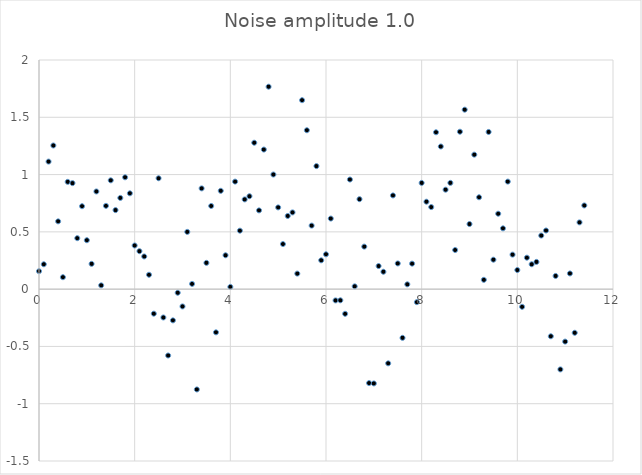
| Category | Series 0 |
|---|---|
| 0.0 | 0.157 |
| 0.1 | 0.217 |
| 0.2 | 1.113 |
| 0.3 | 1.254 |
| 0.4 | 0.592 |
| 0.5 | 0.104 |
| 0.6 | 0.936 |
| 0.7 | 0.925 |
| 0.8 | 0.445 |
| 0.9 | 0.724 |
| 1.0 | 0.427 |
| 1.1 | 0.221 |
| 1.2 | 0.853 |
| 1.3 | 0.033 |
| 1.4 | 0.727 |
| 1.5 | 0.95 |
| 1.6 | 0.69 |
| 1.7 | 0.796 |
| 1.8 | 0.976 |
| 1.900000000000001 | 0.836 |
| 2.0 | 0.381 |
| 2.100000000000001 | 0.331 |
| 2.200000000000001 | 0.285 |
| 2.300000000000001 | 0.125 |
| 2.400000000000001 | -0.214 |
| 2.500000000000001 | 0.968 |
| 2.600000000000001 | -0.247 |
| 2.700000000000001 | -0.579 |
| 2.800000000000001 | -0.272 |
| 2.900000000000001 | -0.031 |
| 3.000000000000001 | -0.151 |
| 3.100000000000001 | 0.5 |
| 3.200000000000001 | 0.046 |
| 3.300000000000002 | -0.876 |
| 3.400000000000002 | 0.879 |
| 3.500000000000002 | 0.23 |
| 3.600000000000002 | 0.726 |
| 3.700000000000002 | -0.377 |
| 3.800000000000002 | 0.858 |
| 3.900000000000002 | 0.296 |
| 4.000000000000002 | 0.019 |
| 4.100000000000001 | 0.939 |
| 4.200000000000001 | 0.51 |
| 4.300000000000001 | 0.783 |
| 4.4 | 0.811 |
| 4.5 | 1.278 |
| 4.6 | 0.687 |
| 4.699999999999999 | 1.218 |
| 4.799999999999999 | 1.767 |
| 4.899999999999999 | 1 |
| 4.999999999999998 | 0.713 |
| 5.099999999999998 | 0.394 |
| 5.199999999999997 | 0.639 |
| 5.299999999999997 | 0.67 |
| 5.399999999999997 | 0.136 |
| 5.499999999999996 | 1.649 |
| 5.599999999999996 | 1.387 |
| 5.699999999999996 | 0.555 |
| 5.799999999999995 | 1.074 |
| 5.899999999999995 | 0.252 |
| 5.999999999999994 | 0.304 |
| 6.099999999999994 | 0.616 |
| 6.199999999999994 | -0.098 |
| 6.299999999999994 | -0.097 |
| 6.399999999999993 | -0.215 |
| 6.499999999999993 | 0.957 |
| 6.599999999999993 | 0.024 |
| 6.699999999999992 | 0.785 |
| 6.799999999999992 | 0.371 |
| 6.899999999999991 | -0.82 |
| 6.999999999999991 | -0.823 |
| 7.099999999999991 | 0.202 |
| 7.19999999999999 | 0.152 |
| 7.29999999999999 | -0.647 |
| 7.39999999999999 | 0.818 |
| 7.49999999999999 | 0.224 |
| 7.599999999999989 | -0.425 |
| 7.699999999999989 | 0.042 |
| 7.799999999999988 | 0.222 |
| 7.899999999999988 | -0.114 |
| 7.999999999999987 | 0.927 |
| 8.099999999999987 | 0.763 |
| 8.199999999999987 | 0.716 |
| 8.299999999999986 | 1.369 |
| 8.399999999999986 | 1.245 |
| 8.499999999999986 | 0.868 |
| 8.599999999999985 | 0.928 |
| 8.699999999999983 | 0.342 |
| 8.799999999999985 | 1.374 |
| 8.899999999999984 | 1.566 |
| 8.999999999999982 | 0.568 |
| 9.099999999999984 | 1.174 |
| 9.199999999999983 | 0.802 |
| 9.299999999999981 | 0.081 |
| 9.39999999999998 | 1.372 |
| 9.49999999999998 | 0.257 |
| 9.59999999999998 | 0.658 |
| 9.69999999999998 | 0.531 |
| 9.79999999999998 | 0.939 |
| 9.89999999999998 | 0.301 |
| 9.99999999999998 | 0.167 |
| 10.09999999999998 | -0.154 |
| 10.19999999999998 | 0.274 |
| 10.29999999999998 | 0.217 |
| 10.39999999999998 | 0.238 |
| 10.49999999999998 | 0.468 |
| 10.59999999999998 | 0.512 |
| 10.69999999999998 | -0.411 |
| 10.79999999999998 | 0.115 |
| 10.89999999999998 | -0.701 |
| 10.99999999999998 | -0.458 |
| 11.09999999999998 | 0.137 |
| 11.19999999999998 | -0.381 |
| 11.29999999999998 | 0.583 |
| 11.39999999999998 | 0.731 |